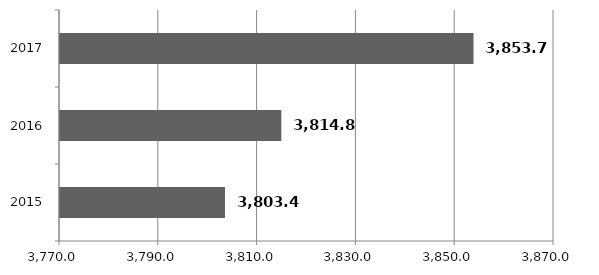
| Category | Series 0 |
|---|---|
| 2015.0 | 3803.4 |
| 2016.0 | 3814.8 |
| 2017.0 | 3853.7 |